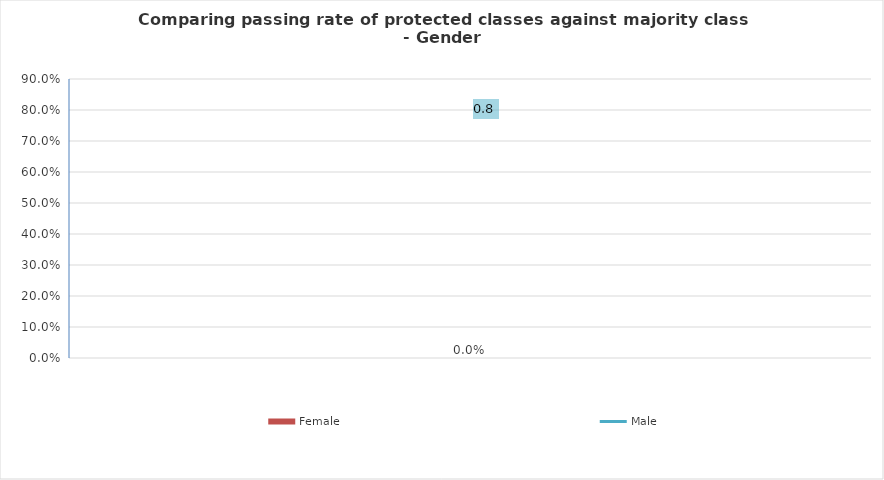
| Category | Female |
|---|---|
| Must be 80% or greater to satisfy 4/5ths rule | 0 |